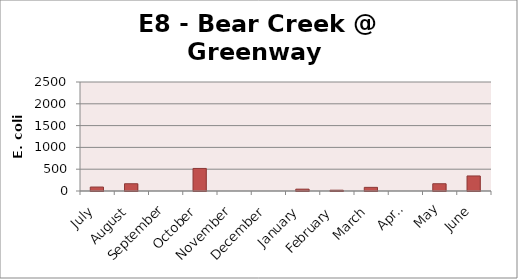
| Category | E. coli MPN |
|---|---|
| July | 90.9 |
| August | 166.4 |
| September | 0 |
| October | 517.2 |
| November | 0 |
| December | 0 |
| January | 42.6 |
| February | 18.1 |
| March | 83.3 |
| April | 0 |
| May | 166.4 |
| June | 344.8 |